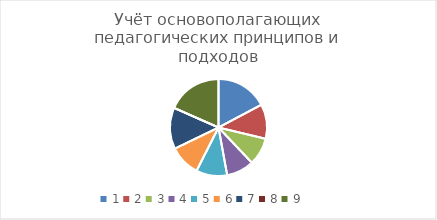
| Category | Series 0 |
|---|---|
| 0 | 0.294 |
| 1 | 0.196 |
| 2 | 0.157 |
| 3 | 0.157 |
| 4 | 0.176 |
| 5 | 0.176 |
| 6 | 0.235 |
| 7 | 0 |
| 8 | 0.314 |